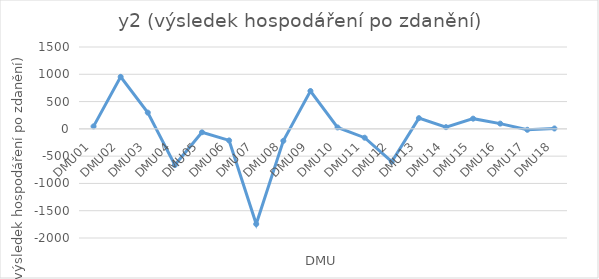
| Category | y2 (výsledek hospodáření po zdanění) |
|---|---|
| DMU01 | 45 |
| DMU02 | 953 |
| DMU03 | 298 |
| DMU04 | -663 |
| DMU05 | -62 |
| DMU06 | -212 |
| DMU07 | -1744 |
| DMU08 | -220 |
| DMU09 | 694 |
| DMU10 | 26 |
| DMU11 | -162 |
| DMU12 | -602 |
| DMU13 | 196 |
| DMU14 | 31 |
| DMU15 | 187 |
| DMU16 | 96 |
| DMU17 | -17 |
| DMU18 | 7 |